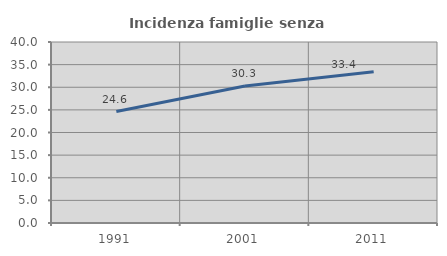
| Category | Incidenza famiglie senza nuclei |
|---|---|
| 1991.0 | 24.636 |
| 2001.0 | 30.255 |
| 2011.0 | 33.446 |